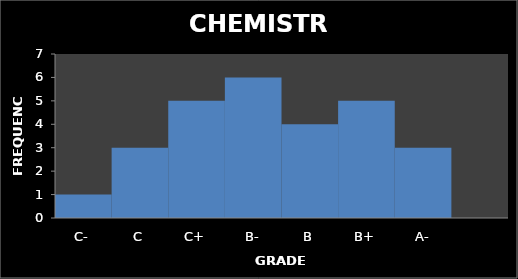
| Category | Series 0 |
|---|---|
| C- | 1 |
| C | 3 |
| C+ | 5 |
| B- | 6 |
| B | 4 |
| B+ | 5 |
| A- | 3 |